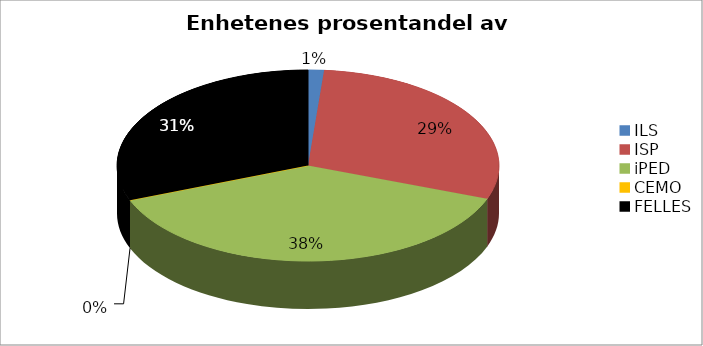
| Category | Series 0 |
|---|---|
| ILS | 6833.333 |
| ISP | 148966.667 |
| iPED | 195433.333 |
| CEMO | 0 |
| FELLES | 157166.667 |